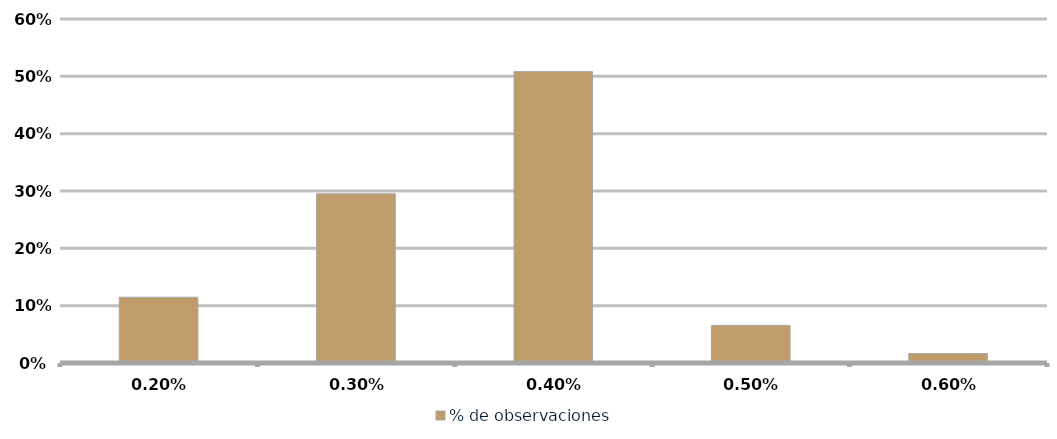
| Category | % de observaciones  |
|---|---|
| 0.002 | 0.115 |
| 0.003 | 0.295 |
| 0.004 | 0.508 |
| 0.005 | 0.066 |
| 0.006 | 0.016 |